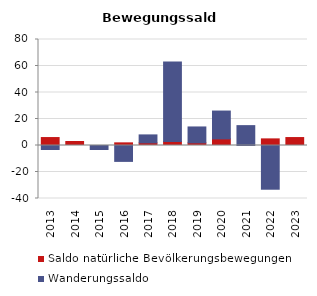
| Category | Saldo natürliche Bevölkerungsbewegungen | Wanderungssaldo |
|---|---|---|
| 2013.0 | 6 | -3 |
| 2014.0 | 3 | 0 |
| 2015.0 | 0 | -3 |
| 2016.0 | 2 | -12 |
| 2017.0 | 2 | 6 |
| 2018.0 | 3 | 60 |
| 2019.0 | 2 | 12 |
| 2020.0 | 5 | 21 |
| 2021.0 | 0 | 15 |
| 2022.0 | 5 | -33 |
| 2023.0 | 6 | 0 |